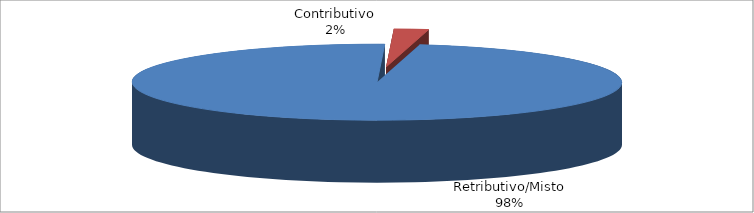
| Category | Series 1 |
|---|---|
| Retributivo/Misto | 24263 |
| Contributivo | 565 |